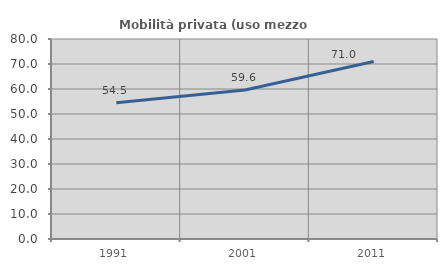
| Category | Mobilità privata (uso mezzo privato) |
|---|---|
| 1991.0 | 54.545 |
| 2001.0 | 59.615 |
| 2011.0 | 71.028 |